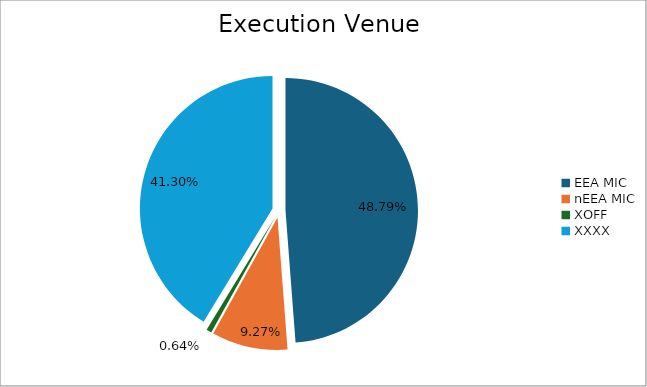
| Category | Series 0 |
|---|---|
| EEA MIC | 7058829.083 |
| nEEA MIC | 1340559.931 |
| XOFF | 93267.603 |
| XXXX | 5974540.35 |